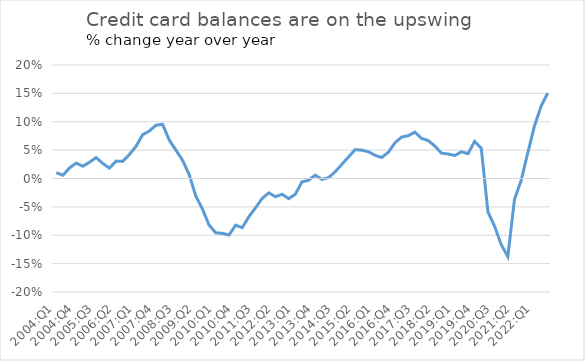
| Category | % change year-year |
|---|---|
| 2004:Q1 | 0.01 |
| 2004:Q2 | 0.006 |
| 2004:Q3 | 0.019 |
| 2004:Q4 | 0.027 |
| 2005:Q1 | 0.022 |
| 2005:Q2 | 0.029 |
| 2005:Q3 | 0.037 |
| 2005:Q4 | 0.026 |
| 2006:Q1 | 0.018 |
| 2006:Q2 | 0.031 |
| 2006:Q3 | 0.03 |
| 2006:Q4 | 0.042 |
| 2007:Q1 | 0.057 |
| 2007:Q2 | 0.077 |
| 2007:Q3 | 0.084 |
| 2007:Q4 | 0.094 |
| 2008:Q1 | 0.096 |
| 2008:Q2 | 0.068 |
| 2008:Q3 | 0.05 |
| 2008:Q4 | 0.032 |
| 2009:Q1 | 0.007 |
| 2009:Q2 | -0.031 |
| 2009:Q3 | -0.054 |
| 2009:Q4 | -0.082 |
| 2010:Q1 | -0.096 |
| 2010:Q2 | -0.097 |
| 2010:Q3 | -0.1 |
| 2010:Q4 | -0.082 |
| 2011:Q1 | -0.087 |
| 2011:Q2 | -0.067 |
| 2011:Q3 | -0.052 |
| 2011:Q4 | -0.035 |
| 2012:Q1 | -0.025 |
| 2012:Q2 | -0.032 |
| 2012:Q3 | -0.028 |
| 2012:Q4 | -0.036 |
| 2013:Q1 | -0.028 |
| 2013:Q2 | -0.006 |
| 2013:Q3 | -0.003 |
| 2013:Q4 | 0.006 |
| 2014:Q1 | -0.002 |
| 2014:Q2 | 0.002 |
| 2014:Q3 | 0.012 |
| 2014:Q4 | 0.025 |
| 2015:Q1 | 0.038 |
| 2015:Q2 | 0.051 |
| 2015:Q3 | 0.05 |
| 2015:Q4 | 0.047 |
| 2016:Q1 | 0.041 |
| 2016:Q2 | 0.037 |
| 2016:Q3 | 0.046 |
| 2016:Q4 | 0.063 |
| 2017:Q1 | 0.073 |
| 2017:Q2 | 0.075 |
| 2017:Q3 | 0.082 |
| 2017:Q4 | 0.071 |
| 2018:Q1 | 0.067 |
| 2018:Q2 | 0.057 |
| 2018:Q3 | 0.045 |
| 2018:Q4 | 0.043 |
| 2019:Q1 | 0.04 |
| 2019:Q2 | 0.047 |
| 2019:Q3 | 0.044 |
| 2019:Q4 | 0.066 |
| 2020:Q1 | 0.053 |
| 2020:Q2 | -0.059 |
| 2020:Q3 | -0.084 |
| 2020:Q4 | -0.116 |
| 2021:Q1 | -0.138 |
| 2021:Q2 | -0.037 |
| 2021:Q3 | -0.004 |
| 2021:Q4 | 0.045 |
| 2022:Q1 | 0.092 |
| 2022:Q2 | 0.127 |
| 2022:Q3 | 0.15 |